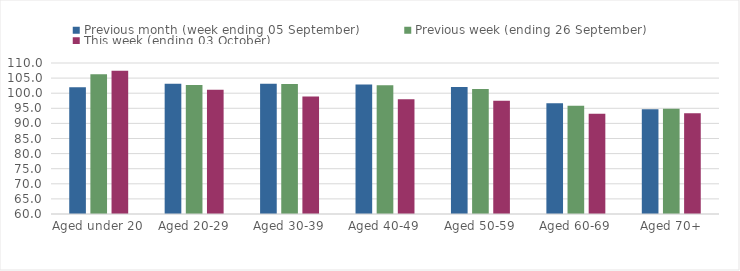
| Category | Previous month (week ending 05 September) | Previous week (ending 26 September) | This week (ending 03 October) |
|---|---|---|---|
| Aged under 20 | 101.96 | 106.26 | 107.43 |
| Aged 20-29 | 103.13 | 102.72 | 101.13 |
| Aged 30-39 | 103.14 | 103.06 | 98.88 |
| Aged 40-49 | 102.89 | 102.66 | 98.02 |
| Aged 50-59 | 102.05 | 101.38 | 97.54 |
| Aged 60-69 | 96.68 | 95.81 | 93.19 |
| Aged 70+ | 94.69 | 94.84 | 93.33 |